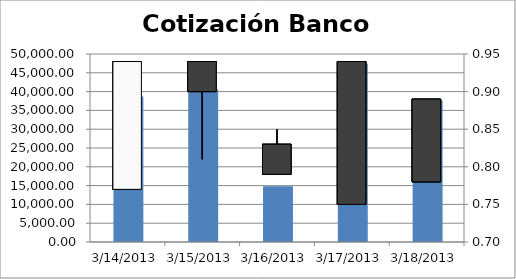
| Category | Series 0 |
|---|---|
| 14/03/2013 | 38708 |
| 15/03/2013 | 40589 |
| 16/03/2013 | 14830 |
| 17/03/2013 | 47397 |
| 18/03/2013 | 37645 |